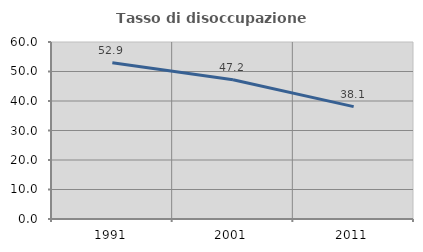
| Category | Tasso di disoccupazione giovanile  |
|---|---|
| 1991.0 | 52.941 |
| 2001.0 | 47.222 |
| 2011.0 | 38.095 |